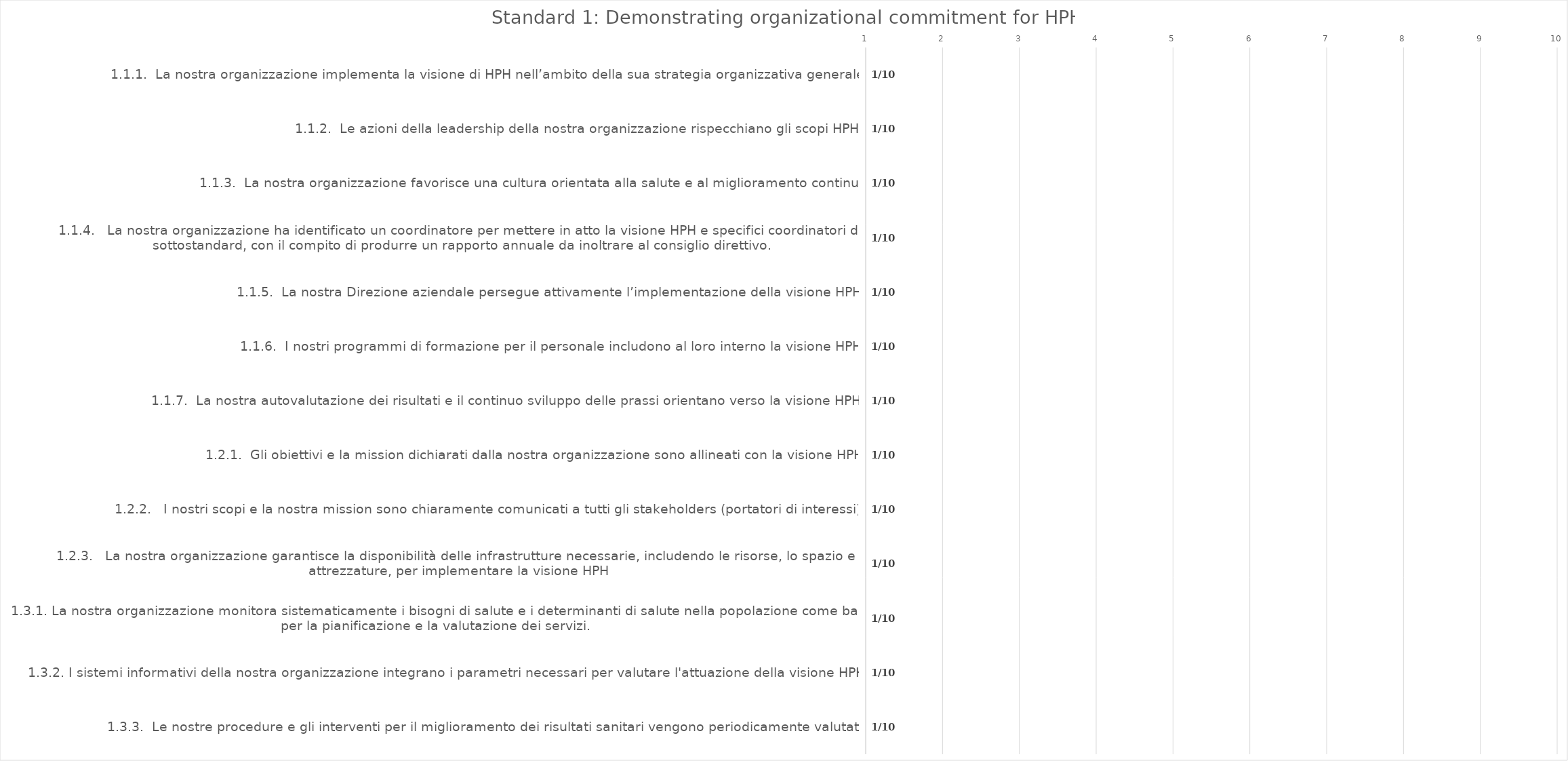
| Category | value |
|---|---|
| 1.1.1.  La nostra organizzazione implementa la visione di HPH nell’ambito della sua strategia organizzativa generale. | 1 |
| 1.1.2.  Le azioni della leadership della nostra organizzazione rispecchiano gli scopi HPH. | 1 |
| 1.1.3.  La nostra organizzazione favorisce una cultura orientata alla salute e al miglioramento continuo | 1 |
| 1.1.4.   La nostra organizzazione ha identificato un coordinatore per mettere in atto la visione HPH e specifici coordinatori dei sottostandard, con il compito di produrre un rapporto annuale da inoltrare al consiglio direttivo. | 1 |
| 1.1.5.  La nostra Direzione aziendale persegue attivamente l’implementazione della visione HPH. | 1 |
| 1.1.6.  I nostri programmi di formazione per il personale includono al loro interno la visione HPH. | 1 |
| 1.1.7.  La nostra autovalutazione dei risultati e il continuo sviluppo delle prassi orientano verso la visione HPH. | 1 |
| 1.2.1.  Gli obiettivi e la mission dichiarati dalla nostra organizzazione sono allineati con la visione HPH | 1 |
| 1.2.2.   I nostri scopi e la nostra mission sono chiaramente comunicati a tutti gli stakeholders (portatori di interessi). | 1 |
| 1.2.3.   La nostra organizzazione garantisce la disponibilità delle infrastrutture necessarie, includendo le risorse, lo spazio e le attrezzature, per implementare la visione HPH | 1 |
| 1.3.1. La nostra organizzazione monitora sistematicamente i bisogni di salute e i determinanti di salute nella popolazione come base per la pianificazione e la valutazione dei servizi. | 1 |
| 1.3.2. I sistemi informativi della nostra organizzazione integrano i parametri necessari per valutare l'attuazione della visione HPH. | 1 |
| 1.3.3.  Le nostre procedure e gli interventi per il miglioramento dei risultati sanitari vengono periodicamente valutati. | 1 |